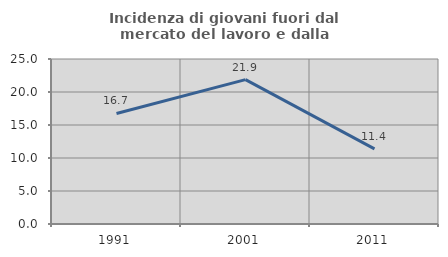
| Category | Incidenza di giovani fuori dal mercato del lavoro e dalla formazione  |
|---|---|
| 1991.0 | 16.743 |
| 2001.0 | 21.87 |
| 2011.0 | 11.386 |